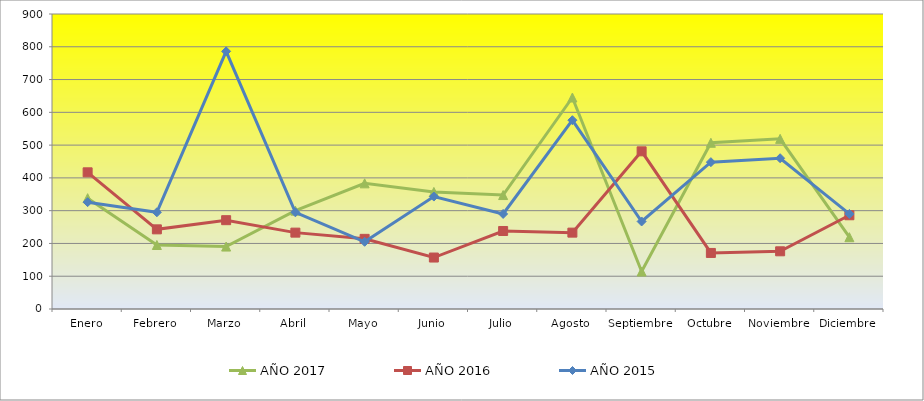
| Category | AÑO 2017 | AÑO 2016 | AÑO 2015 |
|---|---|---|---|
| Enero | 338.095 | 417 | 326 |
| Febrero | 195.238 | 243 | 295 |
| Marzo | 190.476 | 271 | 786 |
| Abril | 300 | 233 | 295 |
| Mayo | 383.333 | 214 | 205 |
| Junio | 357.143 | 157 | 343 |
| Julio | 347.619 | 238 | 290 |
| Agosto | 645.238 | 233 | 576 |
| Septiembre | 114.286 | 481 | 267 |
| Octubre | 507.143 | 171 | 448 |
| Noviembre | 519.048 | 176 | 460 |
| Diciembre | 219.048 | 286 | 290 |